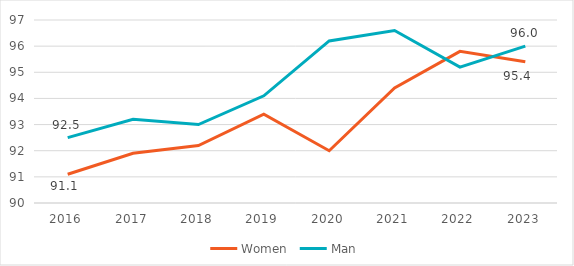
| Category | Women | Man |
|---|---|---|
| 2016.0 | 91.1 | 92.5 |
| 2017.0 | 91.9 | 93.2 |
| 2018.0 | 92.2 | 93 |
| 2019.0 | 93.4 | 94.1 |
| 2020.0 | 92 | 96.2 |
| 2021.0 | 94.4 | 96.6 |
| 2022.0 | 95.8 | 95.2 |
| 2023.0 | 95.4 | 96 |